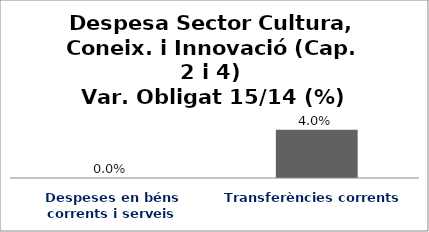
| Category | Series 0 |
|---|---|
| Despeses en béns corrents i serveis | 0 |
| Transferències corrents | 0.04 |